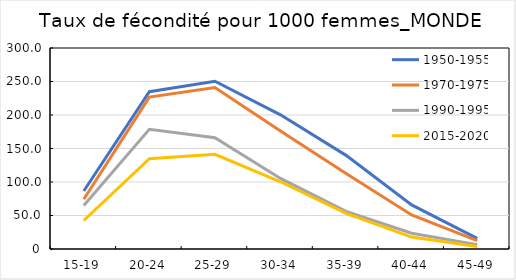
| Category | 1950-1955 | 1970-1975 | 1990-1995 | 2015-2020 |
|---|---|---|---|---|
| 15-19 | 86.537 | 74.309 | 64.811 | 42.537 |
| 20-24 | 234.738 | 226.759 | 178.775 | 134.695 |
| 25-29 | 250.373 | 241.122 | 166.044 | 141.421 |
| 30-34 | 200.311 | 176.131 | 105.361 | 100.357 |
| 35-39 | 139.766 | 112.642 | 56.046 | 53.065 |
| 40-44 | 65.869 | 50.882 | 23.45 | 17.766 |
| 45-49 | 15.879 | 12.381 | 6.517 | 3.781 |